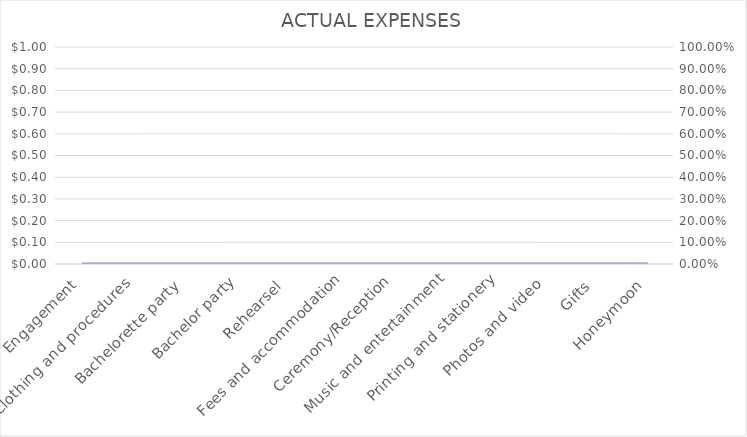
| Category | Series 0 |
|---|---|
| Engagement | 0 |
| Clothing and procedures | 0 |
| Bachelorette party | 0 |
| Bachelor party | 0 |
| Rehearsel | 0 |
| Fees and accommodation | 0 |
| Ceremony/Reception | 0 |
| Music and entertainment | 0 |
| Printing and stationery | 0 |
| Photos and video | 0 |
| Gifts | 0 |
| Honeymoon | 0 |